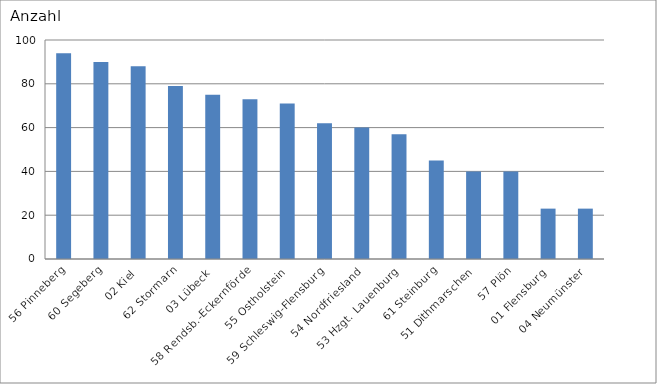
| Category | 56 Pinneberg 60 Segeberg 02 Kiel 62 Stormarn 03 Lübeck 58 Rendsb.-Eckernförde 55 Ostholstein 59 Schleswig-Flensburg 54 Nordfriesland 53 Hzgt. Lauenburg 61 Steinburg 51 Dithmarschen 57 Plön 01 Flensburg 04 Neumünster |
|---|---|
| 56 Pinneberg | 94 |
| 60 Segeberg | 90 |
| 02 Kiel | 88 |
| 62 Stormarn | 79 |
| 03 Lübeck | 75 |
| 58 Rendsb.-Eckernförde | 73 |
| 55 Ostholstein | 71 |
| 59 Schleswig-Flensburg | 62 |
| 54 Nordfriesland | 60 |
| 53 Hzgt. Lauenburg | 57 |
| 61 Steinburg | 45 |
| 51 Dithmarschen | 40 |
| 57 Plön | 40 |
| 01 Flensburg | 23 |
| 04 Neumünster | 23 |